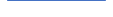
| Category | Series 0 |
|---|---|
| 0 | 0 |
| 1 | 0 |
| 2 | 1 |
| 3 | 0 |
| 4 | 0 |
| 5 | 1 |
| 6 | 3 |
| 7 | 3 |
| 8 | 1 |